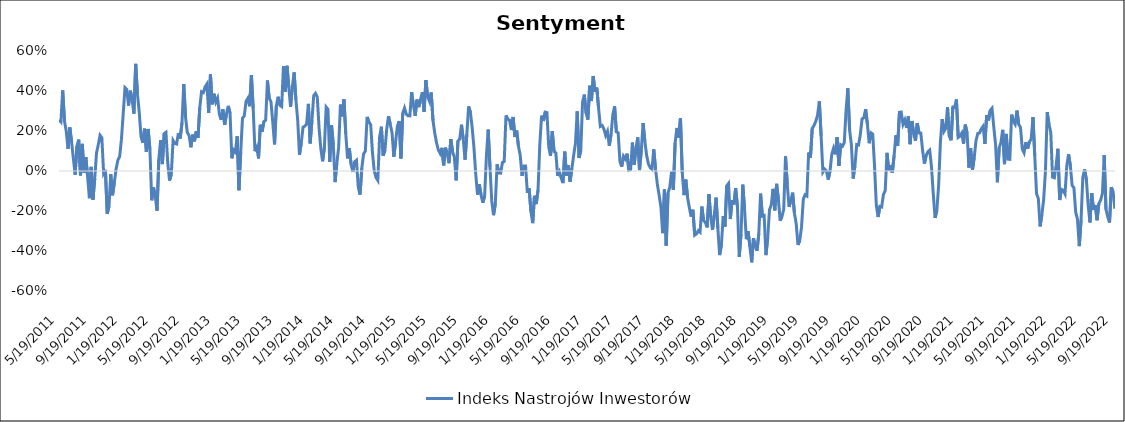
| Category | Indeks Nastrojów Inwestorów |
|---|---|
| 5/19/11 | 0.255 |
| 5/26/11 | 0.245 |
| 6/2/11 | 0.403 |
| 6/9/11 | 0.25 |
| 6/16/11 | 0.199 |
| 6/23/11 | 0.11 |
| 6/30/11 | 0.218 |
| 7/7/11 | 0.145 |
| 7/14/11 | 0.063 |
| 7/21/11 | -0.019 |
| 7/28/11 | 0.125 |
| 8/4/11 | 0.157 |
| 8/11/11 | -0.022 |
| 8/18/11 | 0.136 |
| 8/25/11 | -0.008 |
| 9/1/11 | 0.07 |
| 9/8/11 | -0.028 |
| 9/15/11 | -0.136 |
| 9/22/11 | 0.02 |
| 9/29/11 | -0.144 |
| 10/6/11 | -0.038 |
| 10/13/11 | 0.09 |
| 10/20/11 | 0.132 |
| 10/27/11 | 0.179 |
| 11/3/11 | 0.167 |
| 11/10/11 | -0.012 |
| 11/17/11 | 0.005 |
| 11/24/11 | -0.214 |
| 12/1/11 | -0.177 |
| 12/8/11 | -0.016 |
| 12/15/11 | -0.121 |
| 12/22/11 | -0.06 |
| 12/29/11 | 0.01 |
| 1/5/12 | 0.054 |
| 1/12/12 | 0.073 |
| 1/19/12 | 0.159 |
| 1/26/12 | 0.287 |
| 2/2/12 | 0.417 |
| 2/9/12 | 0.408 |
| 2/16/12 | 0.327 |
| 2/23/12 | 0.402 |
| 3/1/12 | 0.357 |
| 3/8/12 | 0.287 |
| 3/15/12 | 0.536 |
| 3/22/12 | 0.384 |
| 3/29/12 | 0.294 |
| 4/5/12 | 0.172 |
| 4/12/12 | 0.141 |
| 4/19/12 | 0.212 |
| 4/26/12 | 0.096 |
| 5/3/12 | 0.21 |
| 5/10/12 | 0.107 |
| 5/17/12 | -0.146 |
| 5/24/12 | -0.081 |
| 5/31/12 | -0.128 |
| 6/7/12 | -0.198 |
| 6/14/12 | 0.058 |
| 6/21/12 | 0.154 |
| 6/28/12 | 0.034 |
| 7/5/12 | 0.187 |
| 7/12/12 | 0.193 |
| 7/19/12 | 0.042 |
| 7/26/12 | -0.048 |
| 8/2/12 | -0.017 |
| 8/9/12 | 0.153 |
| 8/16/12 | 0.138 |
| 8/23/12 | 0.135 |
| 8/30/12 | 0.189 |
| 9/6/12 | 0.163 |
| 9/13/12 | 0.241 |
| 9/20/12 | 0.434 |
| 9/27/12 | 0.27 |
| 10/4/12 | 0.193 |
| 10/11/12 | 0.177 |
| 10/18/12 | 0.119 |
| 10/25/12 | 0.182 |
| 11/1/12 | 0.148 |
| 11/8/12 | 0.198 |
| 11/15/12 | 0.166 |
| 11/22/12 | 0.317 |
| 11/29/12 | 0.396 |
| 12/6/12 | 0.392 |
| 12/13/12 | 0.421 |
| 12/20/12 | 0.435 |
| 12/27/12 | 0.29 |
| 1/3/13 | 0.482 |
| 1/10/13 | 0.333 |
| 1/17/13 | 0.386 |
| 1/24/13 | 0.344 |
| 1/31/13 | 0.365 |
| 2/7/13 | 0.285 |
| 2/14/13 | 0.256 |
| 2/21/13 | 0.308 |
| 2/28/13 | 0.231 |
| 3/7/13 | 0.285 |
| 3/14/13 | 0.326 |
| 3/21/13 | 0.29 |
| 3/28/13 | 0.063 |
| 4/4/13 | 0.105 |
| 4/11/13 | 0.094 |
| 4/18/13 | 0.174 |
| 4/25/13 | -0.096 |
| 5/2/13 | 0.097 |
| 5/9/13 | 0.264 |
| 5/16/13 | 0.276 |
| 5/23/13 | 0.349 |
| 5/30/13 | 0.364 |
| 6/6/13 | 0.324 |
| 6/13/13 | 0.48 |
| 6/20/13 | 0.313 |
| 6/27/13 | 0.099 |
| 7/4/13 | 0.118 |
| 7/11/13 | 0.063 |
| 7/18/13 | 0.231 |
| 7/25/13 | 0.197 |
| 8/1/13 | 0.247 |
| 8/8/13 | 0.254 |
| 8/15/13 | 0.453 |
| 8/22/13 | 0.364 |
| 8/29/13 | 0.346 |
| 9/5/13 | 0.243 |
| 9/12/13 | 0.133 |
| 9/19/13 | 0.326 |
| 9/26/13 | 0.371 |
| 10/3/13 | 0.329 |
| 10/10/13 | 0.322 |
| 10/17/13 | 0.523 |
| 10/24/13 | 0.396 |
| 10/31/13 | 0.526 |
| 11/7/13 | 0.418 |
| 11/14/13 | 0.321 |
| 11/21/13 | 0.422 |
| 11/28/13 | 0.493 |
| 12/5/13 | 0.355 |
| 12/12/13 | 0.255 |
| 12/19/13 | 0.081 |
| 12/26/13 | 0.14 |
| 1/2/14 | 0.219 |
| 1/9/14 | 0.224 |
| 1/16/14 | 0.234 |
| 1/23/14 | 0.336 |
| 1/30/14 | 0.138 |
| 2/6/14 | 0.253 |
| 2/13/14 | 0.377 |
| 2/20/14 | 0.388 |
| 2/27/14 | 0.37 |
| 3/6/14 | 0.215 |
| 3/13/14 | 0.112 |
| 3/20/14 | 0.049 |
| 3/27/14 | 0.118 |
| 4/3/14 | 0.32 |
| 4/10/14 | 0.309 |
| 4/17/14 | 0.045 |
| 4/24/14 | 0.229 |
| 5/1/14 | 0.131 |
| 5/8/14 | -0.055 |
| 5/15/14 | 0.04 |
| 5/22/14 | 0.118 |
| 5/29/14 | 0.332 |
| 6/5/14 | 0.273 |
| 6/12/14 | 0.358 |
| 6/19/14 | 0.186 |
| 6/26/14 | 0.063 |
| 7/3/14 | 0.114 |
| 7/10/14 | 0.033 |
| 7/17/14 | -0.005 |
| 7/24/14 | 0.046 |
| 7/31/14 | 0.054 |
| 8/7/14 | -0.079 |
| 8/14/14 | -0.118 |
| 8/21/14 | 0.013 |
| 8/28/14 | 0.085 |
| 9/4/14 | 0.1 |
| 9/11/14 | 0.271 |
| 9/18/14 | 0.245 |
| 9/25/14 | 0.231 |
| 10/2/14 | 0.092 |
| 10/9/14 | 0 |
| 10/16/14 | -0.033 |
| 10/23/14 | -0.047 |
| 10/30/14 | 0.169 |
| 11/6/14 | 0.221 |
| 11/13/14 | 0.076 |
| 11/20/14 | 0.104 |
| 11/27/14 | 0.209 |
| 12/4/14 | 0.274 |
| 12/11/14 | 0.233 |
| 12/18/14 | 0.19 |
| 12/25/14 | 0.07 |
| 1/1/15 | 0.147 |
| 1/8/15 | 0.224 |
| 1/15/15 | 0.25 |
| 1/22/15 | 0.063 |
| 1/29/15 | 0.289 |
| 2/5/15 | 0.315 |
| 2/12/15 | 0.284 |
| 2/19/15 | 0.276 |
| 2/26/15 | 0.276 |
| 3/5/15 | 0.394 |
| 3/12/15 | 0.329 |
| 3/19/15 | 0.276 |
| 3/26/15 | 0.357 |
| 4/2/15 | 0.319 |
| 4/9/15 | 0.357 |
| 4/16/15 | 0.394 |
| 4/23/15 | 0.295 |
| 4/30/15 | 0.454 |
| 5/7/15 | 0.372 |
| 5/14/15 | 0.349 |
| 5/21/15 | 0.393 |
| 5/28/15 | 0.252 |
| 6/4/15 | 0.188 |
| 6/11/15 | 0.141 |
| 6/18/15 | 0.105 |
| 6/25/15 | 0.088 |
| 7/2/15 | 0.116 |
| 7/9/15 | 0.028 |
| 7/16/15 | 0.117 |
| 7/23/15 | 0.087 |
| 7/30/15 | 0.039 |
| 8/6/15 | 0.159 |
| 8/13/15 | 0.095 |
| 8/20/15 | 0.068 |
| 8/27/15 | -0.047 |
| 9/3/15 | 0.15 |
| 9/10/15 | 0.16 |
| 9/17/15 | 0.231 |
| 9/24/15 | 0.159 |
| 10/1/15 | 0.057 |
| 10/8/15 | 0.183 |
| 10/15/15 | 0.323 |
| 10/22/15 | 0.294 |
| 10/29/15 | 0.217 |
| 11/5/15 | 0.116 |
| 11/12/15 | -0.015 |
| 11/19/15 | -0.118 |
| 11/26/15 | -0.066 |
| 12/3/15 | -0.12 |
| 12/10/15 | -0.159 |
| 12/17/15 | -0.125 |
| 12/24/15 | 0.074 |
| 12/31/15 | 0.207 |
| 1/7/16 | 0.02 |
| 1/14/16 | -0.149 |
| 1/21/16 | -0.221 |
| 1/28/16 | -0.164 |
| 2/4/16 | 0.033 |
| 2/11/16 | -0.01 |
| 2/18/16 | -0.011 |
| 2/25/16 | 0.043 |
| 3/3/16 | 0.048 |
| 3/10/16 | 0.278 |
| 3/17/16 | 0.259 |
| 3/24/16 | 0.255 |
| 3/31/16 | 0.205 |
| 4/7/16 | 0.27 |
| 4/14/16 | 0.17 |
| 4/21/16 | 0.203 |
| 4/28/16 | 0.124 |
| 5/5/16 | 0.078 |
| 5/12/16 | -0.024 |
| 5/19/16 | 0.025 |
| 5/26/16 | 0.025 |
| 6/2/16 | -0.109 |
| 6/9/16 | -0.087 |
| 6/16/16 | -0.202 |
| 6/23/16 | -0.261 |
| 6/30/16 | -0.124 |
| 7/7/16 | -0.165 |
| 7/14/16 | -0.094 |
| 7/21/16 | 0.135 |
| 7/28/16 | 0.277 |
| 8/4/16 | 0.25 |
| 8/11/16 | 0.294 |
| 8/18/16 | 0.292 |
| 8/25/16 | 0.122 |
| 9/1/16 | 0.075 |
| 9/8/16 | 0.198 |
| 9/15/16 | 0.098 |
| 9/22/16 | 0.09 |
| 9/29/16 | -0.024 |
| 10/6/16 | -0.004 |
| 10/13/16 | -0.035 |
| 10/20/16 | -0.06 |
| 10/27/16 | 0.097 |
| 11/3/16 | -0.023 |
| 11/10/16 | 0.028 |
| 11/17/16 | -0.054 |
| 11/24/16 | 0.013 |
| 12/1/16 | 0.078 |
| 12/8/16 | 0.137 |
| 12/15/16 | 0.298 |
| 12/22/16 | 0.065 |
| 12/29/16 | 0.102 |
| 1/5/17 | 0.344 |
| 1/12/17 | 0.382 |
| 1/19/17 | 0.289 |
| 1/26/17 | 0.257 |
| 2/2/17 | 0.426 |
| 2/9/17 | 0.35 |
| 2/16/17 | 0.475 |
| 2/23/17 | 0.396 |
| 3/2/17 | 0.417 |
| 3/9/17 | 0.315 |
| 3/16/17 | 0.223 |
| 3/23/17 | 0.228 |
| 3/30/17 | 0.21 |
| 4/6/17 | 0.178 |
| 4/13/17 | 0.199 |
| 4/20/17 | 0.127 |
| 4/27/17 | 0.182 |
| 5/4/17 | 0.28 |
| 5/11/17 | 0.323 |
| 5/18/17 | 0.196 |
| 5/25/17 | 0.191 |
| 6/1/17 | 0.047 |
| 6/8/17 | 0.022 |
| 6/15/17 | 0.074 |
| 6/22/17 | 0.06 |
| 6/29/17 | 0.087 |
| 7/6/17 | 0.004 |
| 7/13/17 | 0.007 |
| 7/20/17 | 0.142 |
| 7/27/17 | 0.031 |
| 8/3/17 | 0.114 |
| 8/10/17 | 0.168 |
| 8/17/17 | 0.005 |
| 8/24/17 | 0.102 |
| 8/31/17 | 0.24 |
| 9/7/17 | 0.148 |
| 9/14/17 | 0.078 |
| 9/21/17 | 0.036 |
| 9/28/17 | 0.017 |
| 10/5/17 | 0.008 |
| 10/12/17 | 0.108 |
| 10/19/17 | 0.009 |
| 10/26/17 | -0.065 |
| 11/2/17 | -0.12 |
| 11/9/17 | -0.18 |
| 11/16/17 | -0.311 |
| 11/23/17 | -0.093 |
| 11/30/17 | -0.373 |
| 12/7/17 | -0.11 |
| 12/14/17 | -0.081 |
| 12/21/17 | -0.004 |
| 12/28/17 | -0.093 |
| 1/4/18 | 0.141 |
| 1/11/18 | 0.215 |
| 1/18/18 | 0.167 |
| 1/25/18 | 0.264 |
| 2/1/18 | -0.009 |
| 2/8/18 | -0.12 |
| 2/15/18 | -0.043 |
| 2/22/18 | -0.133 |
| 3/1/18 | -0.184 |
| 3/8/18 | -0.228 |
| 3/15/18 | -0.194 |
| 3/22/18 | -0.321 |
| 3/29/18 | -0.315 |
| 4/5/18 | -0.299 |
| 4/12/18 | -0.306 |
| 4/19/18 | -0.178 |
| 4/26/18 | -0.248 |
| 5/3/18 | -0.258 |
| 5/10/18 | -0.282 |
| 5/17/18 | -0.116 |
| 5/24/18 | -0.23 |
| 5/31/18 | -0.295 |
| 6/7/18 | -0.22 |
| 6/14/18 | -0.133 |
| 6/21/18 | -0.286 |
| 6/28/18 | -0.421 |
| 7/5/18 | -0.368 |
| 7/12/18 | -0.226 |
| 7/19/18 | -0.278 |
| 7/26/18 | -0.075 |
| 8/2/18 | -0.063 |
| 8/9/18 | -0.24 |
| 8/16/18 | -0.147 |
| 8/23/18 | -0.167 |
| 8/30/18 | -0.086 |
| 9/6/18 | -0.178 |
| 9/13/18 | -0.43 |
| 9/20/18 | -0.317 |
| 9/27/18 | -0.068 |
| 10/4/18 | -0.192 |
| 10/11/18 | -0.341 |
| 10/18/18 | -0.302 |
| 10/25/18 | -0.379 |
| 11/1/18 | -0.457 |
| 11/8/18 | -0.336 |
| 11/15/18 | -0.378 |
| 11/22/18 | -0.398 |
| 11/29/18 | -0.313 |
| 12/6/18 | -0.113 |
| 12/13/18 | -0.225 |
| 12/20/18 | -0.223 |
| 12/27/18 | -0.421 |
| 1/3/19 | -0.335 |
| 1/10/19 | -0.194 |
| 1/17/19 | -0.17 |
| 1/24/19 | -0.089 |
| 1/31/19 | -0.197 |
| 2/7/19 | -0.064 |
| 2/14/19 | -0.142 |
| 2/21/19 | -0.248 |
| 2/28/19 | -0.228 |
| 3/7/19 | -0.191 |
| 3/14/19 | 0.073 |
| 3/21/19 | -0.069 |
| 3/28/19 | -0.18 |
| 4/4/19 | -0.147 |
| 4/11/19 | -0.108 |
| 4/18/19 | -0.211 |
| 4/25/19 | -0.263 |
| 5/2/19 | -0.369 |
| 5/9/19 | -0.348 |
| 5/16/19 | -0.28 |
| 5/23/19 | -0.141 |
| 5/30/19 | -0.119 |
| 6/6/19 | -0.125 |
| 6/13/19 | 0.092 |
| 6/20/19 | 0.067 |
| 6/27/19 | 0.212 |
| 7/4/19 | 0.228 |
| 7/11/19 | 0.249 |
| 7/18/19 | 0.279 |
| 7/25/19 | 0.348 |
| 8/1/19 | 0.175 |
| 8/8/19 | -0.005 |
| 8/15/19 | 0.009 |
| 8/22/19 | 0 |
| 8/29/19 | -0.043 |
| 9/5/19 | 0 |
| 9/12/19 | 0.083 |
| 9/19/19 | 0.114 |
| 9/26/19 | 0.083 |
| 10/3/19 | 0.169 |
| 10/10/19 | 0.026 |
| 10/17/19 | 0.131 |
| 10/24/19 | 0.124 |
| 10/31/19 | 0.142 |
| 11/7/19 | 0.301 |
| 11/14/19 | 0.414 |
| 11/21/19 | 0.205 |
| 11/28/19 | 0.132 |
| 12/5/19 | -0.037 |
| 12/12/19 | 0.027 |
| 12/19/19 | 0.132 |
| 12/26/19 | 0.129 |
| 1/2/20 | 0.181 |
| 1/9/20 | 0.26 |
| 1/16/20 | 0.266 |
| 1/23/20 | 0.309 |
| 1/30/20 | 0.234 |
| 2/6/20 | 0.139 |
| 2/13/20 | 0.191 |
| 2/20/20 | 0.185 |
| 2/27/20 | 0.026 |
| 3/5/20 | -0.17 |
| 3/12/20 | -0.23 |
| 3/19/20 | -0.177 |
| 3/26/20 | -0.18 |
| 4/2/20 | -0.118 |
| 4/9/20 | -0.098 |
| 4/16/20 | 0.091 |
| 4/23/20 | 0 |
| 4/30/20 | 0.029 |
| 5/7/20 | -0.009 |
| 5/14/20 | 0.078 |
| 5/21/20 | 0.179 |
| 5/28/20 | 0.127 |
| 6/4/20 | 0.293 |
| 6/11/20 | 0.295 |
| 6/18/20 | 0.233 |
| 6/25/20 | 0.255 |
| 7/2/20 | 0.216 |
| 7/9/20 | 0.273 |
| 7/16/20 | 0.134 |
| 7/23/20 | 0.25 |
| 7/30/20 | 0.189 |
| 8/6/20 | 0.15 |
| 8/13/20 | 0.24 |
| 8/20/20 | 0.19 |
| 8/27/20 | 0.189 |
| 9/3/20 | 0.104 |
| 9/10/20 | 0.037 |
| 9/17/20 | 0.077 |
| 9/24/20 | 0.097 |
| 10/1/20 | 0.105 |
| 10/8/20 | 0.02 |
| 10/15/20 | -0.114 |
| 10/22/20 | -0.234 |
| 10/29/20 | -0.198 |
| 11/5/20 | -0.072 |
| 11/12/20 | 0.144 |
| 11/19/20 | 0.259 |
| 11/26/20 | 0.198 |
| 12/3/20 | 0.213 |
| 12/10/20 | 0.319 |
| 12/17/20 | 0.175 |
| 12/24/20 | 0.153 |
| 12/31/20 | 0.32 |
| 1/7/21 | 0.318 |
| 1/14/21 | 0.358 |
| 1/21/21 | 0.168 |
| 1/28/21 | 0.174 |
| 2/4/21 | 0.189 |
| 2/11/21 | 0.136 |
| 2/18/21 | 0.232 |
| 2/25/21 | 0.19 |
| 3/4/21 | 0.017 |
| 3/11/21 | 0.113 |
| 3/18/21 | 0.006 |
| 3/25/21 | 0.067 |
| 4/1/21 | 0.152 |
| 4/8/21 | 0.188 |
| 4/15/21 | 0.19 |
| 4/22/21 | 0.211 |
| 4/29/21 | 0.224 |
| 5/6/21 | 0.135 |
| 5/13/21 | 0.28 |
| 5/20/21 | 0.253 |
| 5/27/21 | 0.303 |
| 6/3/21 | 0.314 |
| 6/10/21 | 0.219 |
| 6/17/21 | 0.132 |
| 6/24/21 | -0.056 |
| 7/1/21 | 0.115 |
| 7/8/21 | 0.143 |
| 7/15/21 | 0.206 |
| 7/22/21 | 0.035 |
| 7/29/21 | 0.185 |
| 8/5/21 | 0.059 |
| 8/12/21 | 0.058 |
| 8/19/21 | 0.282 |
| 8/26/21 | 0.248 |
| 9/2/21 | 0.234 |
| 9/9/21 | 0.302 |
| 9/16/21 | 0.234 |
| 9/23/21 | 0.217 |
| 9/30/21 | 0.109 |
| 10/7/21 | 0.091 |
| 10/14/21 | 0.145 |
| 10/21/21 | 0.111 |
| 10/28/21 | 0.146 |
| 11/4/21 | 0.159 |
| 11/11/21 | 0.27 |
| 11/18/21 | 0.076 |
| 11/25/21 | -0.113 |
| 12/2/21 | -0.138 |
| 12/9/21 | -0.277 |
| 12/16/21 | -0.218 |
| 12/23/21 | -0.143 |
| 12/30/21 | 0 |
| 1/6/22 | 0.294 |
| 1/13/22 | 0.233 |
| 1/20/22 | 0.192 |
| 1/27/22 | -0.03 |
| 2/3/22 | -0.034 |
| 2/10/22 | 0.026 |
| 2/17/22 | 0.111 |
| 2/24/22 | -0.145 |
| 3/3/22 | -0.092 |
| 3/10/22 | -0.097 |
| 3/17/22 | -0.115 |
| 3/24/22 | 0.026 |
| 3/31/22 | 0.084 |
| 4/7/22 | 0.026 |
| 4/14/22 | -0.073 |
| 4/21/22 | -0.084 |
| 4/28/22 | -0.206 |
| 5/5/22 | -0.241 |
| 5/12/22 | -0.376 |
| 5/19/22 | -0.246 |
| 5/26/22 | -0.033 |
| 6/2/22 | 0.008 |
| 6/9/22 | -0.044 |
| 6/16/22 | -0.17 |
| 6/23/22 | -0.257 |
| 6/30/22 | -0.11 |
| 7/7/22 | -0.194 |
| 7/14/22 | -0.17 |
| 7/21/22 | -0.246 |
| 7/28/22 | -0.163 |
| 8/4/22 | -0.146 |
| 8/11/22 | -0.112 |
| 8/18/22 | 0.079 |
| 8/25/22 | -0.192 |
| 9/1/22 | -0.229 |
| 9/8/22 | -0.257 |
| 9/15/22 | -0.081 |
| 9/22/22 | -0.105 |
| 9/29/22 | -0.188 |